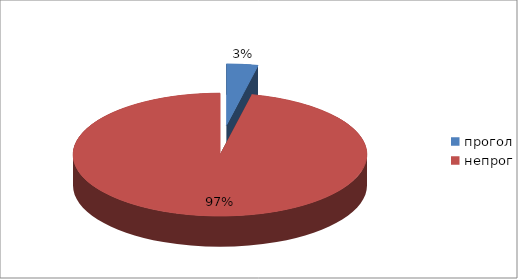
| Category | Series 0 |
|---|---|
| прогол | 24 |
| непрог | 671 |